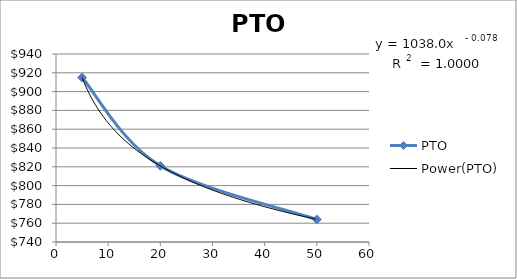
| Category | PTO |
|---|---|
| 5.0 | 915 |
| 20.0 | 821 |
| 50.0 | 764 |